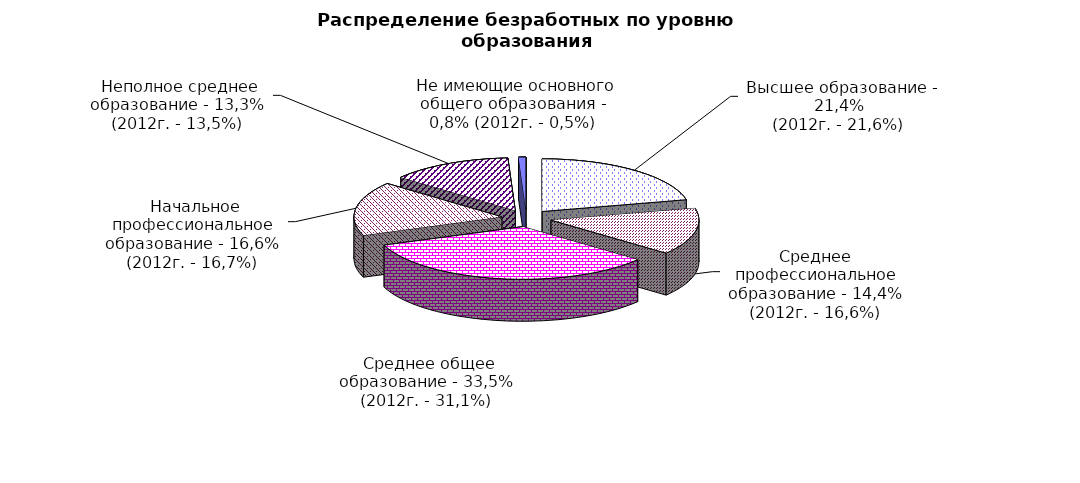
| Category | Series 0 |
|---|---|
|  - высшее образование | 21.4 |
|  - среднее профессиональное образование | 14.4 |
|  - среднее общее образование | 33.5 |
|  - начальное профессиональное образование | 16.6 |
|  - неполное среднее образование | 13.3 |
|  - не имеющие основного общего образования | 0.8 |